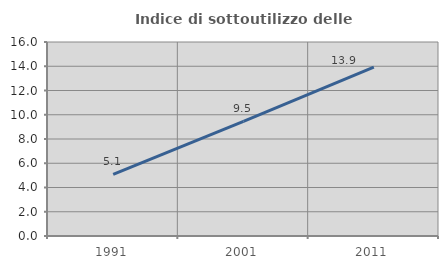
| Category | Indice di sottoutilizzo delle abitazioni  |
|---|---|
| 1991.0 | 5.077 |
| 2001.0 | 9.452 |
| 2011.0 | 13.928 |